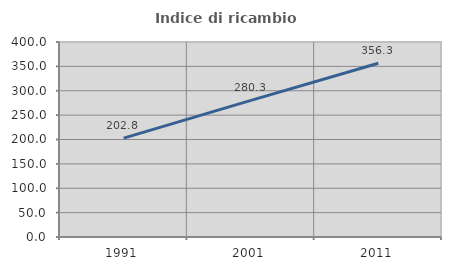
| Category | Indice di ricambio occupazionale  |
|---|---|
| 1991.0 | 202.844 |
| 2001.0 | 280.258 |
| 2011.0 | 356.338 |